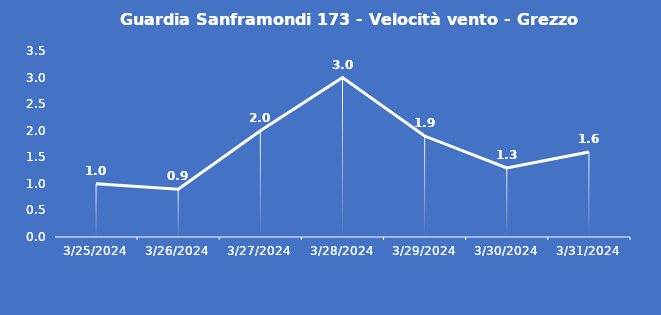
| Category | Guardia Sanframondi 173 - Velocità vento - Grezzo (m/s) |
|---|---|
| 3/25/24 | 1 |
| 3/26/24 | 0.9 |
| 3/27/24 | 2 |
| 3/28/24 | 3 |
| 3/29/24 | 1.9 |
| 3/30/24 | 1.3 |
| 3/31/24 | 1.6 |